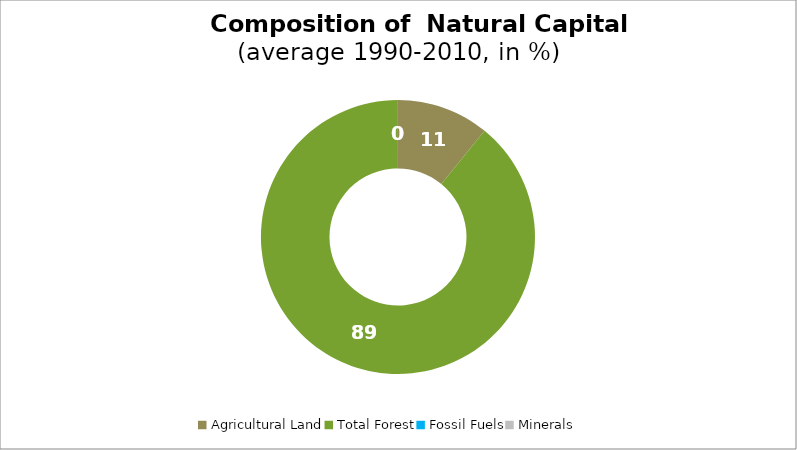
| Category | Series 0 |
|---|---|
| Agricultural Land | 10.889 |
| Total Forest | 89.096 |
| Fossil Fuels | 0.015 |
| Minerals | 0 |